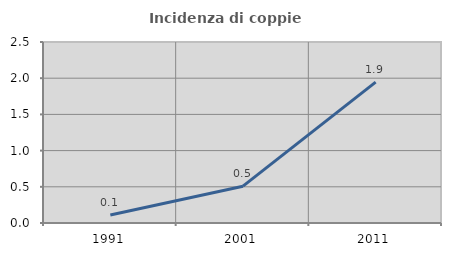
| Category | Incidenza di coppie miste |
|---|---|
| 1991.0 | 0.112 |
| 2001.0 | 0.509 |
| 2011.0 | 1.945 |